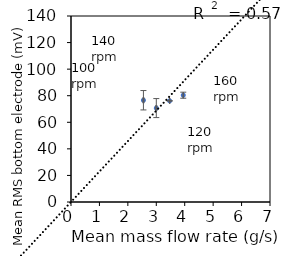
| Category | Series 0 |
|---|---|
| 2.548033333333333 | 76.593 |
| 3.0005666666666664 | 70.69 |
| 3.4709 | 76.119 |
| 3.9486666666666665 | 80.384 |